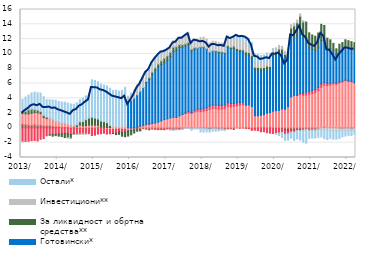
| Category | По трансакционим рачунима | Стамбени | Потрошачки | Готовински* | За ликвидност и обртна средства** | Инвестициони** | Остали* |
|---|---|---|---|---|---|---|---|
| 2013-01-01 | 0.508 | 1.431 | -1.847 | 0 | 0.247 | -0.025 | 1.661 |
| 2013-02-01 | 0.453 | 1.445 | -1.828 | 0 | 0.347 | 0.059 | 1.858 |
| 2013-03-01 | 0.396 | 1.481 | -1.809 | 0 | 0.577 | 0.174 | 1.791 |
| 2013-04-01 | 0.363 | 1.611 | -1.729 | 0 | 0.524 | 0.158 | 2.057 |
| 2013-05-01 | 0.428 | 1.629 | -1.697 | 0 | 0.421 | 0.119 | 2.236 |
| 2013-06-01 | 0.354 | 1.679 | -1.76 | 0 | 0.356 | 0.073 | 2.298 |
| 2013-07-01 | 0.377 | 1.547 | -1.534 | 0 | 0.28 | 0.055 | 2.445 |
| 2013-08-01 | 0.277 | 1.122 | -1.451 | 0 | 0.273 | 0.107 | 2.436 |
| 2013-09-01 | 0.283 | 0.981 | -1.058 | 0 | 0.173 | 0.116 | 2.267 |
| 2013-10-01 | 0.296 | 0.993 | -0.949 | 0 | -0.033 | 0.081 | 2.425 |
| 2013-11-01 | 0.234 | 0.883 | -0.898 | 0 | -0.218 | 0.069 | 2.571 |
| 2013-12-01 | 0.178 | 0.692 | -0.843 | 0 | -0.202 | 0.115 | 2.751 |
| 2014-01-01 | 0.161 | 0.59 | -0.827 | 0 | -0.283 | 0.112 | 2.704 |
| 2014-02-01 | 0.047 | 0.58 | -0.791 | 0 | -0.379 | 0.1 | 2.763 |
| 2014-03-01 | 0.093 | 0.545 | -0.742 | 0 | -0.569 | 0.016 | 2.827 |
| 2014-04-01 | 0.086 | 0.425 | -0.769 | 0 | -0.554 | -0.011 | 2.841 |
| 2014-05-01 | -0.103 | 0.39 | -0.777 | 0 | -0.503 | -0.016 | 2.846 |
| 2014-06-01 | 0.02 | 0.27 | -0.77 | 0 | -0.102 | -0.004 | 2.917 |
| 2014-07-01 | -0.1 | 0.167 | -0.769 | 0 | 0.237 | -0.031 | 2.979 |
| 2014-08-01 | -0.098 | 0.395 | -0.748 | 0 | 0.414 | -0.032 | 3.01 |
| 2014-09-01 | -0.081 | 0.267 | -0.729 | 0 | 0.594 | -0.055 | 3.145 |
| 2014-10-01 | -0.149 | 0.302 | -0.669 | 0 | 0.817 | -0.022 | 3.213 |
| 2014-11-01 | -0.14 | 0.382 | -0.636 | 0 | 0.945 | 0.036 | 3.176 |
| 2014-12-01 | -0.096 | 0.404 | -0.93 | 0 | 1.047 | 0.02 | 5.023 |
| 2015-01-01 | -0.103 | 0.371 | -0.88 | 0 | 0.971 | 0.029 | 5.041 |
| 2015-02-01 | 0.049 | 0.294 | -0.837 | 0 | 0.885 | 0.01 | 4.996 |
| 2015-03-01 | 0.079 | 0.039 | -0.79 | 0 | 0.818 | 0.043 | 4.945 |
| 2015-04-01 | 0.097 | -0.029 | -0.7 | 0 | 0.733 | 0.112 | 4.846 |
| 2015-05-01 | 0.037 | -0.211 | -0.623 | 0 | 0.663 | 0.156 | 4.828 |
| 2015-06-01 | 0.048 | -0.237 | -0.564 | 0 | 0.273 | 0.217 | 4.827 |
| 2015-07-01 | 0.011 | -0.222 | -0.512 | 0 | -0.03 | 0.258 | 4.777 |
| 2015-08-01 | 0.06 | -0.235 | -0.472 | 0 | -0.202 | 0.254 | 4.784 |
| 2015-09-01 | -0.027 | -0.077 | -0.415 | 0 | -0.356 | 0.321 | 4.643 |
| 2015-10-01 | -0.034 | -0.17 | -0.385 | 0 | -0.533 | 0.409 | 4.662 |
| 2015-11-01 | 0.008 | -0.216 | -0.356 | 0 | -0.624 | 0.491 | 4.982 |
| 2015-12-01 | -0.089 | -0.265 | -0.024 | 3.632 | -0.722 | 0.632 | 0.016 |
| 2016-01-01 | -0.127 | -0.175 | -0.021 | 3.762 | -0.611 | 0.682 | 0.257 |
| 2016-02-01 | -0.043 | -0.189 | 0.001 | 4.013 | -0.457 | 0.748 | 0.372 |
| 2016-03-01 | -0.152 | 0.065 | 0.042 | 4.376 | -0.299 | 0.899 | 0.433 |
| 2016-04-01 | -0.291 | 0.194 | 0.05 | 4.714 | -0.12 | 0.918 | 0.433 |
| 2016-05-01 | -0.108 | 0.303 | 0.059 | 5.046 | 0.031 | 0.954 | 0.425 |
| 2016-06-01 | -0.176 | 0.432 | 0.056 | 5.656 | 0.139 | 0.962 | 0.437 |
| 2016-07-01 | -0.255 | 0.503 | 0.03 | 6.024 | 0.239 | 0.947 | 0.404 |
| 2016-08-01 | -0.154 | 0.606 | 0.004 | 6.623 | 0.307 | 0.957 | 0.426 |
| 2016-09-01 | -0.178 | 0.661 | -0.02 | 7.102 | 0.348 | 1.031 | 0.396 |
| 2016-10-01 | -0.176 | 0.793 | -0.055 | 7.461 | 0.394 | 1.006 | 0.414 |
| 2016-11-01 | -0.174 | 0.952 | -0.065 | 7.609 | 0.499 | 0.969 | 0.433 |
| 2016-12-01 | -0.201 | 1.131 | -0.045 | 7.685 | 0.596 | 0.886 | 0.263 |
| 2017-01-01 | -0.106 | 1.22 | -0.024 | 7.92 | 0.595 | 0.87 | 0.053 |
| 2017-02-01 | -0.207 | 1.343 | -0.03 | 8.279 | 0.584 | 0.861 | -0.029 |
| 2017-03-01 | -0.208 | 1.424 | -0.041 | 8.897 | 0.588 | 0.894 | -0.087 |
| 2017-04-01 | -0.152 | 1.419 | -0.038 | 9.037 | 0.509 | 0.925 | -0.101 |
| 2017-05-01 | -0.139 | 1.617 | -0.009 | 9.239 | 0.4 | 0.979 | 0.036 |
| 2017-06-01 | -0.149 | 1.807 | 0.026 | 9.09 | 0.33 | 1.082 | -0.071 |
| 2017-07-01 | -0.013 | 1.938 | 0.095 | 9.039 | 0.286 | 1.153 | -0.047 |
| 2017-08-01 | -0.026 | 2.037 | 0.187 | 9.028 | 0.319 | 1.239 | -0.048 |
| 2017-09-01 | -0.096 | 1.953 | 0.144 | 8.311 | 0.208 | 1.123 | -0.228 |
| 2017-10-01 | -0.014 | 2.157 | 0.238 | 8.209 | 0.241 | 1.163 | -0.142 |
| 2017-11-01 | -0.023 | 2.254 | 0.303 | 8.195 | 0.045 | 1.16 | -0.142 |
| 2017-12-01 | -0.056 | 2.205 | 0.311 | 8.33 | 0.09 | 1.26 | -0.508 |
| 2018-01-01 | -0.081 | 2.265 | 0.327 | 8.3 | 0.083 | 1.278 | -0.481 |
| 2018-02-01 | -0.113 | 2.34 | 0.369 | 7.965 | 0.047 | 1.301 | -0.424 |
| 2018-03-01 | -0.111 | 2.495 | 0.416 | 7.335 | -0.033 | 1.25 | -0.433 |
| 2018-04-01 | -0.081 | 2.649 | 0.463 | 7.33 | -0.002 | 1.282 | -0.359 |
| 2018-05-01 | -0.115 | 2.601 | 0.491 | 7.248 | 0.078 | 1.279 | -0.329 |
| 2018-06-01 | -0.166 | 2.547 | 0.505 | 7.138 | 0.143 | 1.197 | -0.261 |
| 2018-07-01 | -0.145 | 2.554 | 0.495 | 7.101 | 0.124 | 1.2 | -0.178 |
| 2018-08-01 | -0.225 | 2.647 | 0.474 | 6.992 | 0.092 | 1.178 | -0.137 |
| 2018-09-01 | -0.14 | 2.915 | 0.498 | 7.489 | 0.205 | 1.226 | 0.07 |
| 2018-10-01 | -0.125 | 2.846 | 0.442 | 7.456 | 0.158 | 1.193 | 0.104 |
| 2018-11-01 | -0.206 | 2.929 | 0.385 | 7.416 | 0.306 | 1.244 | 0.165 |
| 2018-12-01 | -0.005 | 3.009 | 0.366 | 7.096 | 0.257 | 1.224 | 0.559 |
| 2019-01-01 | -0.045 | 3.078 | 0.343 | 6.898 | 0.267 | 1.186 | 0.594 |
| 2019-02-01 | -0.024 | 3.175 | 0.284 | 6.823 | 0.273 | 1.178 | 0.658 |
| 2019-03-01 | -0.041 | 3.067 | -0.017 | 6.909 | 0.281 | 1.148 | 0.909 |
| 2019-04-01 | -0.041 | 3.102 | -0.071 | 6.728 | 0.35 | 0.959 | 0.944 |
| 2019-05-01 | -0.101 | 2.892 | -0.229 | 6.532 | 0.332 | 0.851 | 0.917 |
| 2019-06-01 | -0.032 | 1.641 | -0.277 | 6.225 | 0.324 | 0.815 | 0.995 |
| 2019-07-01 | -0.025 | 1.64 | -0.34 | 6.167 | 0.367 | 0.718 | 1.061 |
| 2019-08-01 | -0.025 | 1.693 | -0.499 | 6.043 | 0.38 | 0.64 | 1.02 |
| 2019-09-01 | 0.002 | 1.775 | -0.51 | 6.049 | 0.332 | 0.612 | 1.07 |
| 2019-10-01 | -0.05 | 1.982 | -0.601 | 6.001 | 0.376 | 0.64 | 1.135 |
| 2019-11-01 | 0.007 | 2.063 | -0.707 | 6.01 | 0.22 | 0.687 | 1.09 |
| 2019-12-01 | -0.045 | 2.247 | -0.705 | 7.459 | 0.31 | 0.604 | 0.109 |
| 2020-01-31 | -0.067 | 2.32 | -0.682 | 7.598 | 0.358 | 0.543 | -0.107 |
| 2020-02-29 | -0.05 | 2.357 | -0.646 | 7.878 | 0.431 | 0.481 | -0.343 |
| 2020-03-31 | -0.142 | 2.559 | -0.469 | 7.592 | 0.497 | 0.362 | -0.693 |
| 2020-04-30 | -0.391 | 2.519 | -0.482 | 6.976 | 0.428 | 0.428 | -0.807 |
| 2020-05-31 | -0.497 | 2.845 | -0.315 | 6.823 | 0.636 | 0.451 | -0.835 |
| 2020-06-30 | -0.368 | 4.188 | -0.212 | 7.993 | 1.298 | 0.472 | -0.814 |
| 2020-07-31 | -0.412 | 4.363 | -0.136 | 7.827 | 1.569 | 0.389 | -1.144 |
| 2020-08-31 | -0.35 | 4.374 | 0.053 | 7.995 | 1.779 | 0.365 | -1.139 |
| 2020-09-30 | -0.363 | 4.491 | 0.175 | 8.283 | 2.132 | 0.326 | -1.274 |
| 2020-10-31 | -0.292 | 4.411 | 0.268 | 7.607 | 2.03 | 0.189 | -1.627 |
| 2020-11-30 | -0.235 | 4.434 | 0.387 | 7.362 | 2.118 | -0.01 | -1.811 |
| 2020-12-31 | -0.3 | 4.547 | 0.414 | 5.86 | 2.023 | -0.042 | -1.076 |
| 2021-01-31 | -0.28 | 4.676 | 0.397 | 5.527 | 1.958 | -0.051 | -1.044 |
| 2021-02-28 | -0.274 | 4.804 | 0.394 | 5.276 | 1.914 | -0.107 | -0.992 |
| 2021-03-31 | -0.144 | 5.051 | 0.432 | 5.319 | 2.021 | -0.132 | -0.998 |
| 2021-04-30 | 0.02 | 5.477 | 0.452 | 5.848 | 2.198 | -0.185 | -1.043 |
| 2021-05-31 | 0.141 | 5.626 | 0.389 | 5.686 | 1.993 | -0.317 | -1.131 |
| 2021-06-30 | 0.036 | 5.679 | 0.301 | 4.668 | 1.443 | -0.375 | -1.197 |
| 2021-07-31 | 0.04 | 5.754 | 0.271 | 4.664 | 1.174 | -0.352 | -1.069 |
| 2021-08-31 | 0.058 | 5.862 | 0.206 | 4.317 | 0.974 | -0.416 | -1.114 |
| 2021-09-30 | 0 | 5.905 | 0.129 | 3.896 | 0.758 | -0.413 | -1.1 |
| 2021-10-31 | -0.106 | 6.094 | 0.111 | 4.239 | 0.866 | -0.334 | -0.982 |
| 2021-11-30 | -0.109 | 6.221 | 0.093 | 4.228 | 0.989 | -0.268 | -0.834 |
| 2021-12-31 | -0.086 | 6.383 | 0.085 | 4.397 | 1.043 | -0.275 | -0.739 |
| 2022-01-31 | -0.066 | 6.285 | 0.085 | 4.419 | 0.998 | -0.257 | -0.69 |
| 2022-02-28 | -0.123 | 6.24 | 0.072 | 4.354 | 0.989 | -0.228 | -0.683 |
| 2022-03-31 | -0.083 | 6.07 | 0.056 | 4.365 | 1.019 | -0.191 | -0.581 |